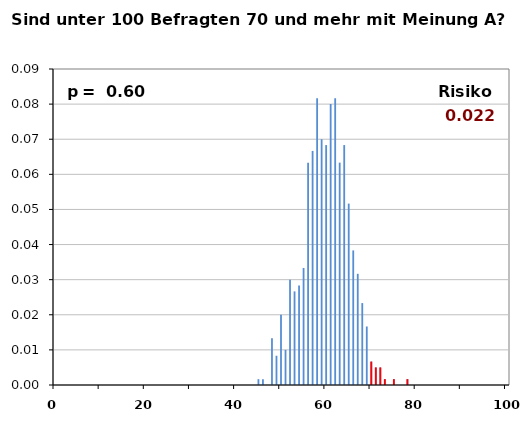
| Category | Series 0 | Series 1 |
|---|---|---|
| 0.0 | 0 | 0 |
| 1.0 | 0 | 0 |
| 2.0 | 0 | 0 |
| 3.0 | 0 | 0 |
| 4.0 | 0 | 0 |
| 5.0 | 0 | 0 |
| 6.0 | 0 | 0 |
| 7.0 | 0 | 0 |
| 8.0 | 0 | 0 |
| 9.0 | 0 | 0 |
| 10.0 | 0 | 0 |
| 11.0 | 0 | 0 |
| 12.0 | 0 | 0 |
| 13.0 | 0 | 0 |
| 14.0 | 0 | 0 |
| 15.0 | 0 | 0 |
| 16.0 | 0 | 0 |
| 17.0 | 0 | 0 |
| 18.0 | 0 | 0 |
| 19.0 | 0 | 0 |
| 20.0 | 0 | 0 |
| 21.0 | 0 | 0 |
| 22.0 | 0 | 0 |
| 23.0 | 0 | 0 |
| 24.0 | 0 | 0 |
| 25.0 | 0 | 0 |
| 26.0 | 0 | 0 |
| 27.0 | 0 | 0 |
| 28.0 | 0 | 0 |
| 29.0 | 0 | 0 |
| 30.0 | 0 | 0 |
| 31.0 | 0 | 0 |
| 32.0 | 0 | 0 |
| 33.0 | 0 | 0 |
| 34.0 | 0 | 0 |
| 35.0 | 0 | 0 |
| 36.0 | 0 | 0 |
| 37.0 | 0 | 0 |
| 38.0 | 0 | 0 |
| 39.0 | 0 | 0 |
| 40.0 | 0 | 0 |
| 41.0 | 0 | 0 |
| 42.0 | 0 | 0 |
| 43.0 | 0 | 0 |
| 44.0 | 0 | 0 |
| 45.0 | 0.002 | 0 |
| 46.0 | 0.002 | 0 |
| 47.0 | 0 | 0 |
| 48.0 | 0.013 | 0 |
| 49.0 | 0.008 | 0 |
| 50.0 | 0.02 | 0 |
| 51.0 | 0.01 | 0 |
| 52.0 | 0.03 | 0 |
| 53.0 | 0.027 | 0 |
| 54.0 | 0.028 | 0 |
| 55.0 | 0.033 | 0 |
| 56.0 | 0.063 | 0 |
| 57.0 | 0.067 | 0 |
| 58.0 | 0.082 | 0 |
| 59.0 | 0.07 | 0 |
| 60.0 | 0.068 | 0 |
| 61.0 | 0.08 | 0 |
| 62.0 | 0.082 | 0 |
| 63.0 | 0.063 | 0 |
| 64.0 | 0.068 | 0 |
| 65.0 | 0.052 | 0 |
| 66.0 | 0.038 | 0 |
| 67.0 | 0.032 | 0 |
| 68.0 | 0.023 | 0 |
| 69.0 | 0.017 | 0 |
| 70.0 | 0.007 | 0.007 |
| 71.0 | 0.005 | 0.005 |
| 72.0 | 0.005 | 0.005 |
| 73.0 | 0.002 | 0.002 |
| 74.0 | 0 | 0 |
| 75.0 | 0.002 | 0.002 |
| 76.0 | 0 | 0 |
| 77.0 | 0 | 0 |
| 78.0 | 0.002 | 0.002 |
| 79.0 | 0 | 0 |
| 80.0 | 0 | 0 |
| 81.0 | 0 | 0 |
| 82.0 | 0 | 0 |
| 83.0 | 0 | 0 |
| 84.0 | 0 | 0 |
| 85.0 | 0 | 0 |
| 86.0 | 0 | 0 |
| 87.0 | 0 | 0 |
| 88.0 | 0 | 0 |
| 89.0 | 0 | 0 |
| 90.0 | 0 | 0 |
| 91.0 | 0 | 0 |
| 92.0 | 0 | 0 |
| 93.0 | 0 | 0 |
| 94.0 | 0 | 0 |
| 95.0 | 0 | 0 |
| 96.0 | 0 | 0 |
| 97.0 | 0 | 0 |
| 98.0 | 0 | 0 |
| 99.0 | 0 | 0 |
| 100.0 | 0 | 0 |